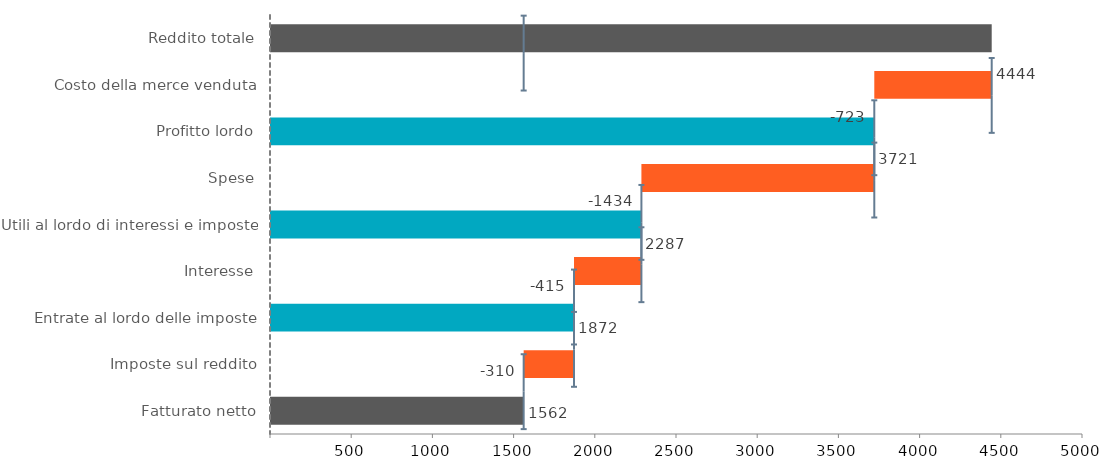
| Category | Fine | Vuoto | PerdNeg | GuadNeg | PerdPos | GuadPos |
|---|---|---|---|---|---|---|
| Reddito totale | 4444 | 0 | 0 | 0 | 0 | 0 |
| Costo della merce venduta | 0 | 3721 | 0 | 0 | 723 | 0 |
| Profitto lordo | 3721 | 0 | 0 | 0 | 0 | 0 |
| Spese | 0 | 2287 | 0 | 0 | 1434 | 0 |
| Utili al lordo di interessi e imposte | 2287 | 0 | 0 | 0 | 0 | 0 |
| Interesse | 0 | 1872 | 0 | 0 | 415 | 0 |
| Entrate al lordo delle imposte | 1872 | 0 | 0 | 0 | 0 | 0 |
| Imposte sul reddito | 0 | 1562 | 0 | 0 | 310 | 0 |
| Fatturato netto | 1562 | 0 | 0 | 0 | 0 | 0 |